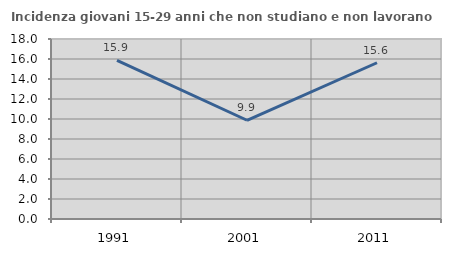
| Category | Incidenza giovani 15-29 anni che non studiano e non lavorano  |
|---|---|
| 1991.0 | 15.864 |
| 2001.0 | 9.874 |
| 2011.0 | 15.625 |